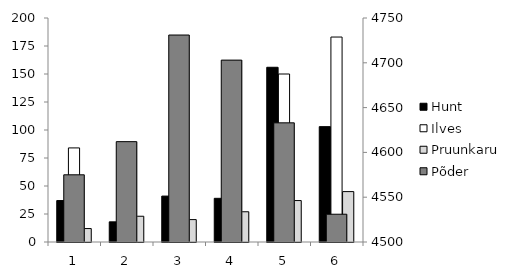
| Category | Hunt | Ilves | Pruunkaru |
|---|---|---|---|
| 1.0 | 37 | 84 | 12 |
| 2.0 | 18 | 86 | 23 |
| 3.0 | 41 | 92 | 20 |
| 4.0 | 39 | 77 | 27 |
| 5.0 | 156 | 150 | 37 |
| 6.0 | 103 | 183 | 45 |